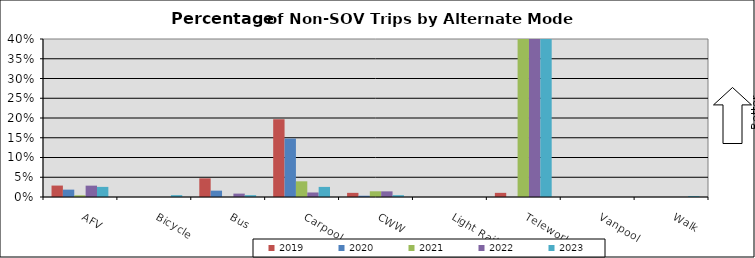
| Category | 2019 | 2020 | 2021 | 2022 | 2023 |
|---|---|---|---|---|---|
| AFV | 0.029 | 0.019 | 0.004 | 0.029 | 0.026 |
| Bicycle | 0 | 0 | 0 | 0 | 0.005 |
| Bus | 0.047 | 0.016 | 0 | 0.009 | 0.005 |
| Carpool | 0.197 | 0.148 | 0.04 | 0.011 | 0.026 |
| CWW | 0.01 | 0.003 | 0.014 | 0.014 | 0.005 |
| Light Rail | 0 | 0 | 0 | 0 | 0 |
| Telework | 0.01 | 0 | 0.625 | 0.52 | 0.495 |
| Vanpool | 0 | 0 | 0 | 0 | 0 |
| Walk | 0 | 0 | 0 | 0 | 0.002 |